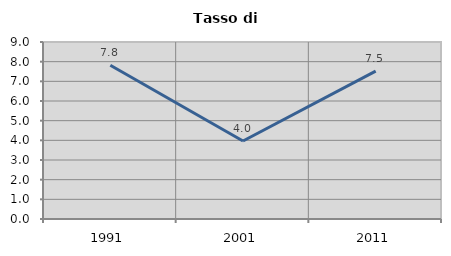
| Category | Tasso di disoccupazione   |
|---|---|
| 1991.0 | 7.817 |
| 2001.0 | 3.964 |
| 2011.0 | 7.522 |